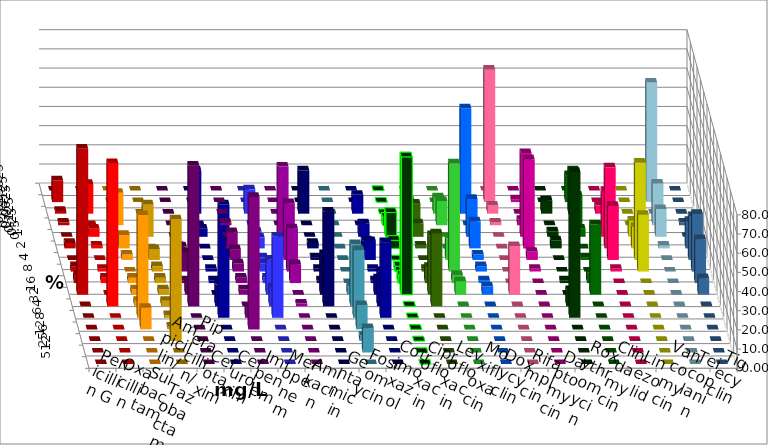
| Category | Penicillin G | Oxacillin | Ampicillin/ Sulbactam | Piperacillin/ Tazobactam | Cefotaxim | Cefuroxim | Imipenem | Meropenem | Amikacin | Gentamicin | Fosfomycin | Cotrimoxazol | Ciprofloxacin | Levofloxacin | Moxifloxacin | Doxycyclin | Rifampicin | Daptomycin | Roxythromycin | Clindamycin | Linezolid | Vancomycin | Teicoplanin | Tigecyclin |
|---|---|---|---|---|---|---|---|---|---|---|---|---|---|---|---|---|---|---|---|---|---|---|---|---|
| 0.015625 | 0 | 0 | 0 | 0 | 0 | 0 | 0 | 0 | 0 | 0 | 0 | 0 | 0 | 0 | 0 | 0 | 0 | 0 | 0 | 0 | 0 | 0 | 0 | 0 |
| 0.03125 | 11.268 | 0 | 0 | 0 | 0 | 0 | 0 | 0 | 0 | 0 | 0 | 0 | 0 | 1.408 | 0 | 0 | 69.014 | 1.408 | 0 | 14.085 | 0 | 0 | 0 | 62.319 |
| 0.0625 | 1.408 | 15.493 | 0 | 0 | 0 | 0 | 22.535 | 12.676 | 0 | 22.535 | 0 | 9.859 | 0 | 0 | 8.451 | 54.93 | 4.225 | 0 | 7.042 | 22.535 | 4.225 | 0 | 0 | 0 |
| 0.125 | 1.408 | 0 | 16.901 | 0 | 0 | 1.408 | 0 | 0 | 0 | 0 | 0 | 0 | 4.225 | 11.268 | 12.676 | 0 | 1.408 | 2.817 | 0 | 15.493 | 0 | 0 | 1.429 | 21.739 |
| 0.25 | 0 | 4.225 | 0 | 16.901 | 0 | 0 | 4.225 | 2.817 | 36.62 | 0 | 0 | 7.042 | 12.676 | 7.042 | 0 | 19.718 | 0 | 43.662 | 2.817 | 4.225 | 23.944 | 8.451 | 0 | 14.493 |
| 0.5 | 2.817 | 1.408 | 7.042 | 0 | 1.408 | 8.451 | 0 | 5.634 | 0 | 2.817 | 0 | 4.225 | 4.225 | 1.408 | 0 | 14.085 | 0 | 46.479 | 4.225 | 0 | 42.254 | 11.268 | 14.286 | 1.449 |
| 1.0 | 0 | 0 | 2.817 | 5.634 | 7.042 | 5.634 | 0 | 1.408 | 29.577 | 1.408 | 0 | 9.859 | 0 | 0 | 11.268 | 2.817 | 0 | 4.225 | 0 | 1.408 | 28.169 | 50.704 | 22.857 | 0 |
| 2.0 | 2.817 | 1.408 | 0 | 2.817 | 9.859 | 4.225 | 1.408 | 4.225 | 22.535 | 1.408 | 0 | 1.408 | 2.817 | 1.408 | 56.338 | 2.817 | 0 | 1.408 | 0 | 0 | 1.408 | 29.577 | 30 | 0 |
| 4.0 | 4.225 | 2.817 | 2.817 | 2.817 | 1.408 | 2.817 | 1.408 | 2.817 | 9.859 | 1.408 | 0 | 1.408 | 4.225 | 8.451 | 4.225 | 1.408 | 0 | 0 | 1.408 | 5.634 | 0 | 0 | 22.857 | 0 |
| 8.0 | 76.056 | 0 | 2.817 | 2.817 | 7.042 | 2.817 | 0 | 18.31 | 0 | 21.127 | 4.225 | 8.451 | 71.831 | 30.986 | 7.042 | 4.225 | 25.352 | 0 | 0 | 36.62 | 0 | 0 | 8.571 | 0 |
| 16.0 | 0 | 74.648 | 2.817 | 2.817 | 73.239 | 0 | 11.268 | 9.859 | 1.408 | 49.296 | 32.394 | 18.31 | 0 | 38.028 | 0 | 0 | 0 | 0 | 8.451 | 0 | 0 | 0 | 0 | 0 |
| 32.0 | 0 | 0 | 53.521 | 1.408 | 0 | 5.634 | 59.155 | 42.254 | 0 | 0 | 35.211 | 39.437 | 0 | 0 | 0 | 0 | 0 | 0 | 76.056 | 0 | 0 | 0 | 0 | 0 |
| 64.0 | 0 | 0 | 11.268 | 1.408 | 0 | 69.014 | 0 | 0 | 0 | 0 | 12.676 | 0 | 0 | 0 | 0 | 0 | 0 | 0 | 0 | 0 | 0 | 0 | 0 | 0 |
| 128.0 | 0 | 0 | 0 | 63.38 | 0 | 0 | 0 | 0 | 0 | 0 | 2.817 | 0 | 0 | 0 | 0 | 0 | 0 | 0 | 0 | 0 | 0 | 0 | 0 | 0 |
| 256.0 | 0 | 0 | 0 | 0 | 0 | 0 | 0 | 0 | 0 | 0 | 12.676 | 0 | 0 | 0 | 0 | 0 | 0 | 0 | 0 | 0 | 0 | 0 | 0 | 0 |
| 512.0 | 0 | 0 | 0 | 0 | 0 | 0 | 0 | 0 | 0 | 0 | 0 | 0 | 0 | 0 | 0 | 0 | 0 | 0 | 0 | 0 | 0 | 0 | 0 | 0 |